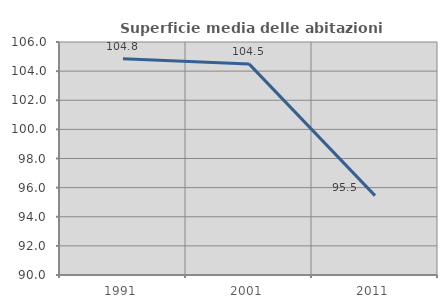
| Category | Superficie media delle abitazioni occupate |
|---|---|
| 1991.0 | 104.849 |
| 2001.0 | 104.497 |
| 2011.0 | 95.451 |